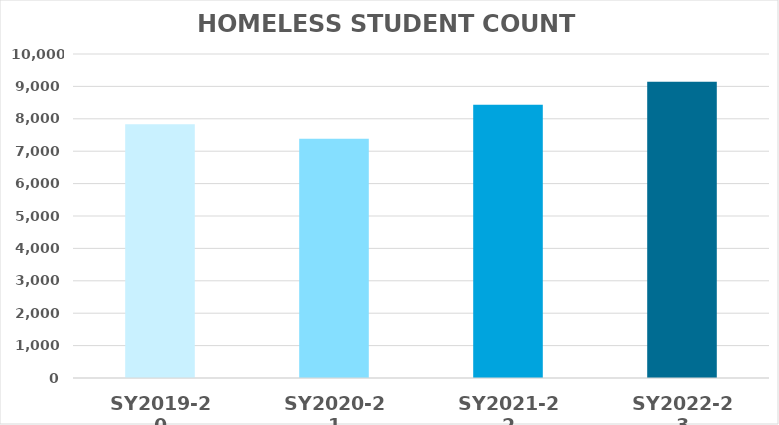
| Category | HOMELESS STUDENT COUNT |
|---|---|
| SY2019-20 | 7835 |
| SY2020-21 | 7381 |
| SY2021-22 | 8433 |
| SY2022-23 | 9144 |